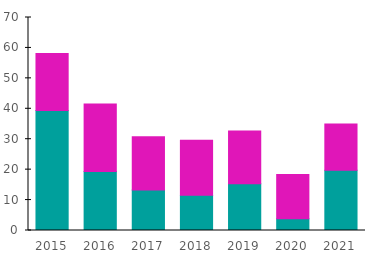
| Category | Herbisidit | Tuhoeläinaineet & Fungisidit |
|---|---|---|
| 2015.0 | 39.4 | 18.8 |
| 2016.0 | 19.4 | 22.2 |
| 2017.0 | 13.3 | 17.5 |
| 2018.0 | 11.6 | 18.1 |
| 2019.0 | 15.4 | 17.3 |
| 2020.0 | 3.9 | 14.5 |
| 2021.0 | 19.8 | 15.2 |